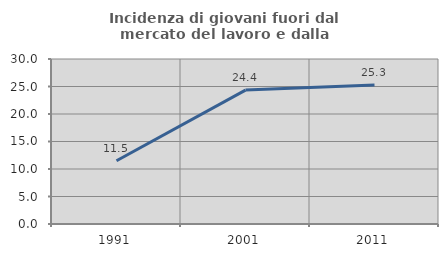
| Category | Incidenza di giovani fuori dal mercato del lavoro e dalla formazione  |
|---|---|
| 1991.0 | 11.489 |
| 2001.0 | 24.352 |
| 2011.0 | 25.287 |